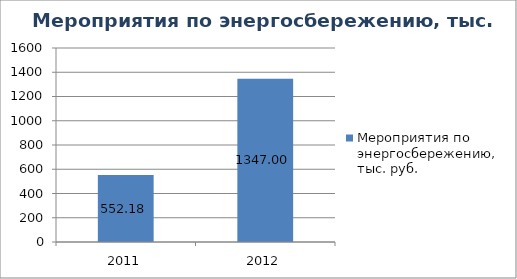
| Category | Мероприятия по энергосбережению, тыс. руб. |
|---|---|
| 2011.0 | 552.18 |
| 2012.0 | 1347 |